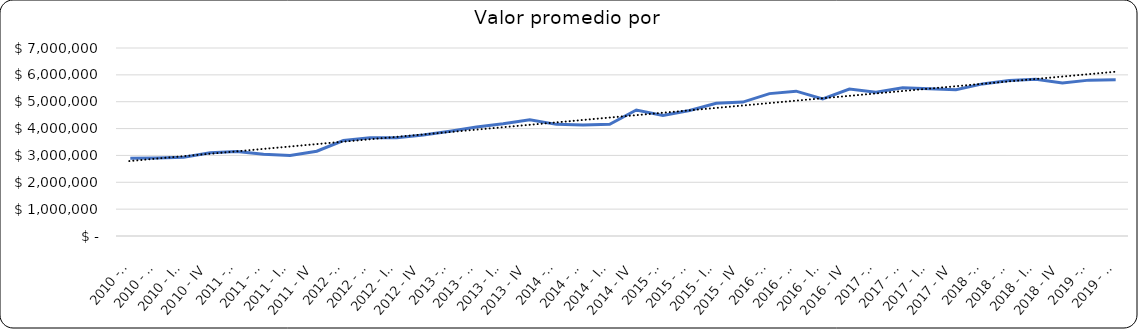
| Category | Valor m2 en Bogotá por sectores |
|---|---|
| 2010 - I | 2895161.29 |
| 2010 - II | 2908520.094 |
| 2010 - III | 2930107.527 |
| 2010 - IV | 3099462.366 |
| 2011 - I | 3143055.556 |
| 2011 - II | 3041666.667 |
| 2011 - III | 3000000 |
| 2011 - IV | 3155409.481 |
| 2012 - I | 3556267.806 |
| 2012 - II | 3653846.154 |
| 2012 - III | 3660968.661 |
| 2012 - IV | 3760683.761 |
| 2013 - I | 3900000 |
| 2013 - II | 4059497.576 |
| 2013 - III | 4175757.576 |
| 2013 - IV | 4327272.727 |
| 2014 - I | 4156521.739 |
| 2014 - II | 4130434.783 |
| 2014 - III | 4159420.29 |
| 2014 - IV | 4692753.623 |
| 2015 - I | 4487179.487 |
| 2015 - II | 4672364.672 |
| 2015 - III | 4939388.177 |
| 2015 - IV | 4985754.986 |
| 2016 - I | 5301888.889 |
| 2016 - II | 5392953.93 |
| 2016 - III | 5101190.476 |
| 2016 - IV | 5470085.47 |
| 2017 - I | 5356125.356 |
| 2017 - II | 5515600 |
| 2017 - III | 5481283.422 |
| 2017 - IV | 5442359.249 |
| 2018 - I | 5663716.814 |
| 2018 - II | 5790423.729 |
| 2018 - III | 5833333 |
| 2018 - IV | 5701754 |
| 2019 - I | 5803571 |
| 2019 - II | 5814978 |